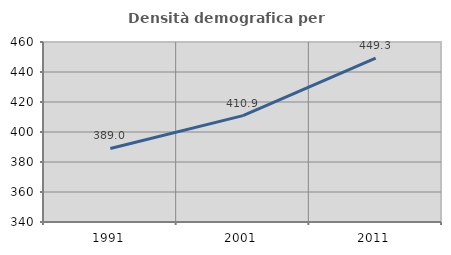
| Category | Densità demografica |
|---|---|
| 1991.0 | 389.004 |
| 2001.0 | 410.897 |
| 2011.0 | 449.281 |